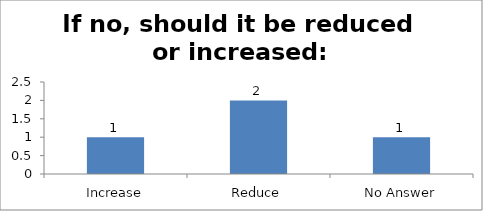
| Category | If no, should it be reduced or increased: |
|---|---|
| Increase | 1 |
| Reduce | 2 |
| No Answer | 1 |